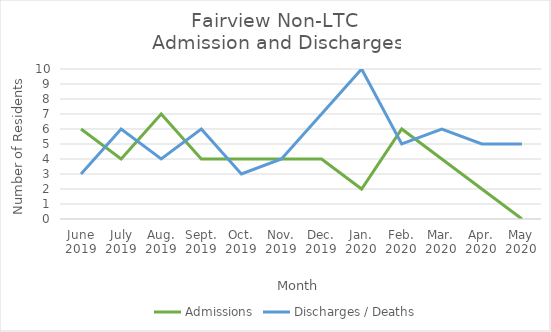
| Category | Admissions | Discharges / Deaths |
|---|---|---|
| June
2019 | 6 | 3 |
| July
2019 | 4 | 6 |
| Aug.
2019 | 7 | 4 |
| Sept.
2019 | 4 | 6 |
| Oct.
2019 | 4 | 3 |
| Nov.
2019 | 4 | 4 |
| Dec.
2019 | 4 | 7 |
| Jan.
2020 | 2 | 10 |
| Feb.
2020 | 6 | 5 |
| Mar.
2020 | 4 | 6 |
| Apr.
2020 | 2 | 5 |
| May
2020 | 0 | 5 |